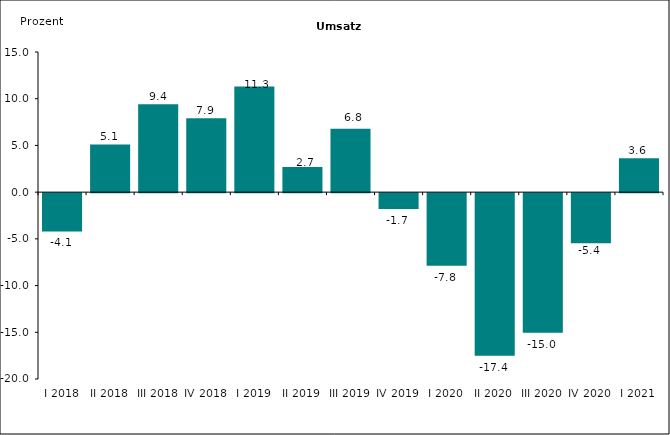
| Category | -4,1 |
|---|---|
| I 2018 | -4.1 |
| II 2018 | 5.1 |
| III 2018 | 9.4 |
| IV 2018 | 7.9 |
| I 2019 | 11.3 |
| II 2019 | 2.702 |
| III 2019 | 6.777 |
| IV 2019 | -1.702 |
| I 2020 | -7.775 |
| II 2020 | -17.405 |
| III 2020 | -14.955 |
| IV 2020 | -5.368 |
| I 2021 | 3.627 |